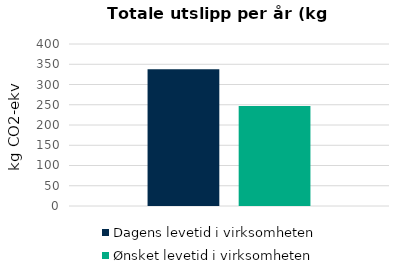
| Category | Dagens levetid i virksomheten | Ønsket levetid i virksomheten |
|---|---|---|
| 0 | 337.833 | 247.167 |